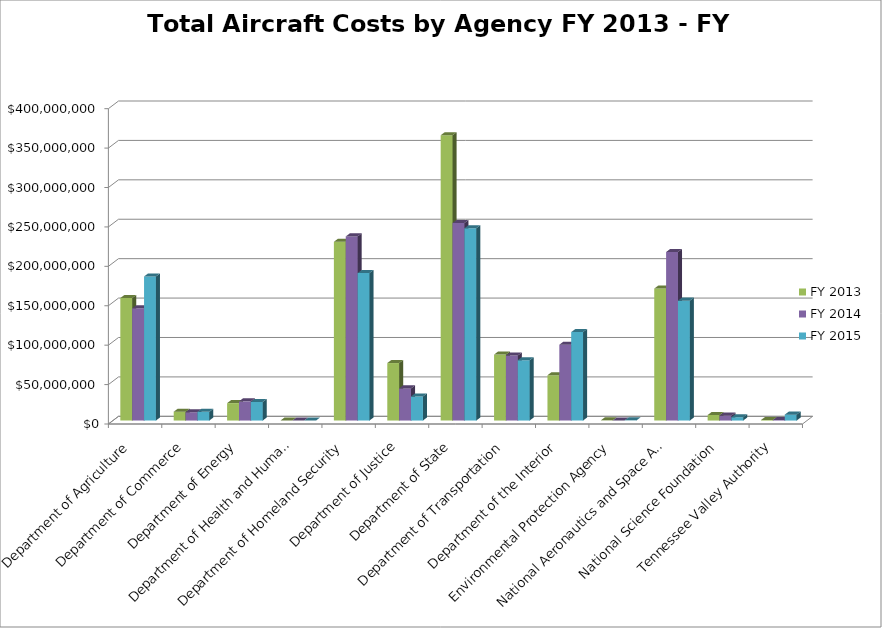
| Category | FY 2013 | FY 2014 | FY 2015 |
|---|---|---|---|
| Department of Agriculture | 155395227 | 142286692 | 182766978 |
| Department of Commerce | 11167070 | 10523256 | 11083859 |
| Department of Energy | 22100903 | 24322856 | 23549439 |
| Department of Health and Human Services | 0 | 0 | 0 |
| Department of Homeland Security | 226775706 | 233554545 | 187032343 |
| Department of Justice | 72911197 | 40790749 | 30478568 |
| Department of State | 361855973 | 250545091 | 243860040 |
| Department of Transportation | 83684482 | 82519582 | 76481166 |
| Department of the Interior | 57436231 | 96191478 | 112175711 |
| Environmental Protection Agency | 259722 | 48805 | 214898 |
| National Aeronautics and Space Administration | 167397561 | 213753911 | 152074855 |
| National Science Foundation | 6996610 | 6142732 | 4199225 |
| Tennessee Valley Authority | 679377 | 665687 | 7487795 |